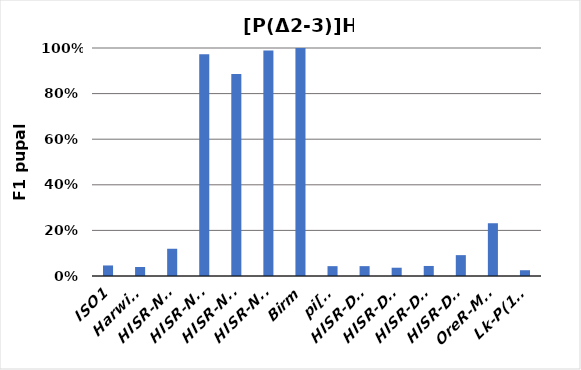
| Category | avg % pupal lethality |
|---|---|
| ISO1 | 0.046 |
| Harwich | 0.04 |
| HISR-N10 | 0.12 |
| HISR-N17 | 0.973 |
| HISR-N25 | 0.886 |
| HISR-N31 | 0.989 |
| Birm | 1 |
| pi[2] | 0.043 |
| HISR-D29 | 0.043 |
| HISR-D43 | 0.036 |
| HISR-D46 | 0.044 |
| HISR-D51 | 0.092 |
| OreR-MOD | 0.231 |
| Lk-P(1A) | 0.025 |